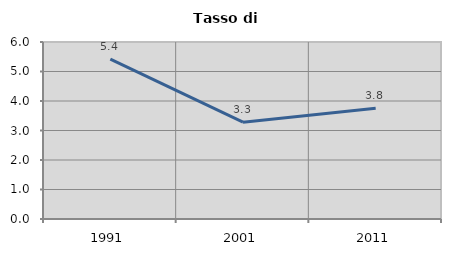
| Category | Tasso di disoccupazione   |
|---|---|
| 1991.0 | 5.421 |
| 2001.0 | 3.281 |
| 2011.0 | 3.756 |